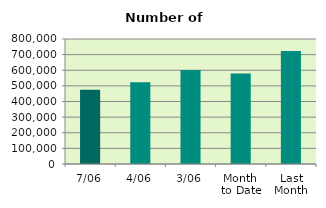
| Category | Series 0 |
|---|---|
| 7/06 | 475652 |
| 4/06 | 523734 |
| 3/06 | 601792 |
| Month 
to Date | 579974.8 |
| Last
Month | 723791.905 |